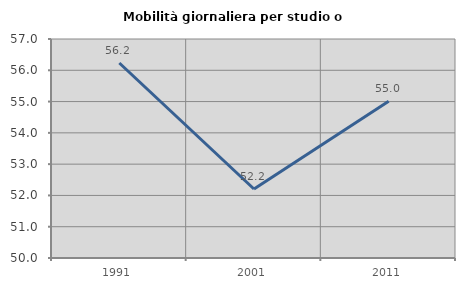
| Category | Mobilità giornaliera per studio o lavoro |
|---|---|
| 1991.0 | 56.232 |
| 2001.0 | 52.205 |
| 2011.0 | 55.007 |